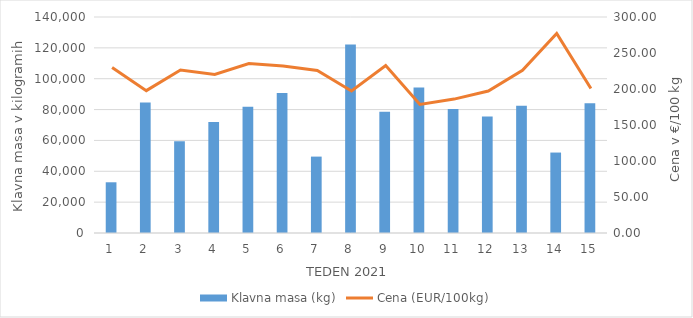
| Category | Klavna masa (kg) |
|---|---|
| 1.0 | 32871 |
| 2.0 | 84639 |
| 3.0 | 59476 |
| 4.0 | 72013 |
| 5.0 | 81759 |
| 6.0 | 90669 |
| 7.0 | 49517 |
| 8.0 | 122111 |
| 9.0 | 78545 |
| 10.0 | 94384 |
| 11.0 | 80405 |
| 12.0 | 75534 |
| 13.0 | 82440 |
| 14.0 | 52143 |
| 15.0 | 84105 |